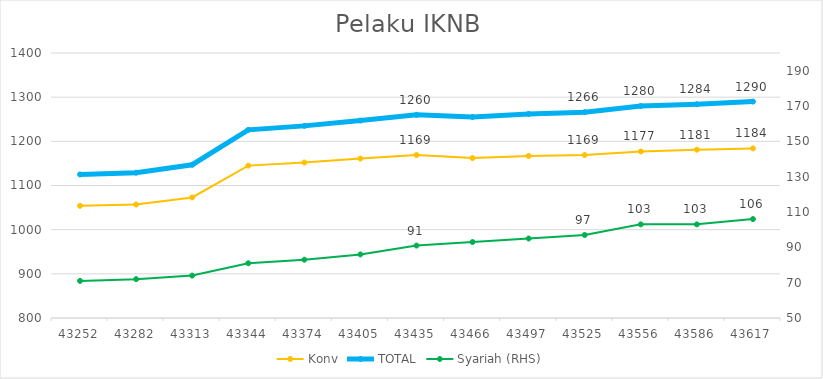
| Category | Konv | TOTAL |
|---|---|---|
| 43252.0 | 1054 | 1125 |
| 43282.0 | 1057 | 1129 |
| 43313.0 | 1073 | 1147 |
| 43344.0 | 1145 | 1226 |
| 43374.0 | 1152 | 1235 |
| 43405.0 | 1161 | 1247 |
| 43435.0 | 1169 | 1260 |
| 43466.0 | 1162 | 1255 |
| 43497.0 | 1167 | 1262 |
| 43525.0 | 1169 | 1266 |
| 43556.0 | 1177 | 1280 |
| 43586.0 | 1181 | 1284 |
| 43617.0 | 1184 | 1290 |